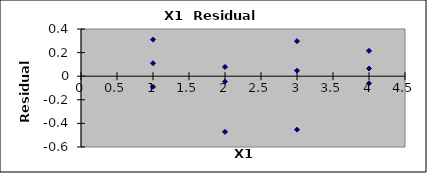
| Category | Series 0 |
|---|---|
| 1.0 | -0.09 |
| 2.0 | 0.078 |
| 3.0 | -0.453 |
| 4.0 | 0.215 |
| 1.0 | 0.31 |
| 2.0 | -0.047 |
| 3.0 | 0.297 |
| 4.0 | -0.06 |
| 1.0 | 0.11 |
| 2.0 | -0.472 |
| 3.0 | 0.047 |
| 4.0 | 0.065 |